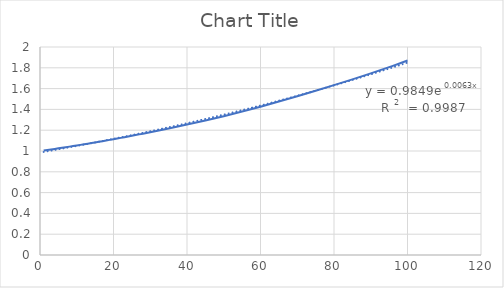
| Category | Series 0 |
|---|---|
| 1.0 | 1.004 |
| 2.0 | 1.009 |
| 3.0 | 1.015 |
| 4.0 | 1.02 |
| 5.0 | 1.026 |
| 6.0 | 1.031 |
| 7.0 | 1.036 |
| 8.0 | 1.042 |
| 9.0 | 1.048 |
| 10.0 | 1.053 |
| 11.0 | 1.059 |
| 12.0 | 1.065 |
| 13.0 | 1.07 |
| 14.0 | 1.076 |
| 15.0 | 1.082 |
| 16.0 | 1.088 |
| 17.0 | 1.095 |
| 18.0 | 1.101 |
| 19.0 | 1.107 |
| 20.0 | 1.113 |
| 21.0 | 1.12 |
| 22.0 | 1.126 |
| 23.0 | 1.133 |
| 24.0 | 1.14 |
| 25.0 | 1.146 |
| 26.0 | 1.153 |
| 27.0 | 1.16 |
| 28.0 | 1.166 |
| 29.0 | 1.174 |
| 30.0 | 1.18 |
| 35.0 | 1.216 |
| 40.0 | 1.254 |
| 45.0 | 1.293 |
| 50.0 | 1.335 |
| 55.0 | 1.379 |
| 60.0 | 1.426 |
| 65.0 | 1.476 |
| 70.0 | 1.526 |
| 75.0 | 1.579 |
| 80.0 | 1.633 |
| 85.0 | 1.689 |
| 90.0 | 1.746 |
| 92.0 | 1.77 |
| 94.0 | 1.794 |
| 96.0 | 1.819 |
| 98.0 | 1.844 |
| 100.0 | 1.87 |